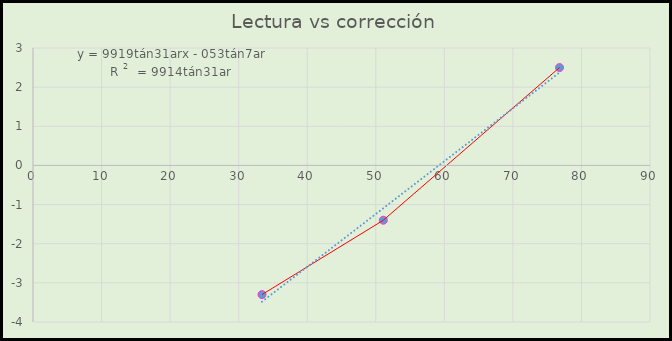
| Category | Corrección %hr |
|---|---|
| 33.4 | -3.3 |
| 51.1 | -1.4 |
| 76.8 | 2.5 |